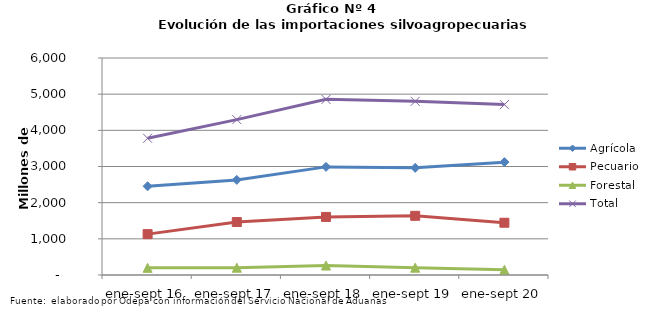
| Category | Agrícola | Pecuario | Forestal | Total |
|---|---|---|---|---|
| ene-sept 16 | 2452386 | 1129978 | 198194 | 3780558 |
| ene-sept 17 | 2629926 | 1464531 | 201873 | 4296330 |
| ene-sept 18 | 2989288 | 1605343 | 262118 | 4856749 |
| ene-sept 19 | 2962612 | 1636729 | 202106 | 4801447 |
| ene-sept 20 | 3120323 | 1445001 | 146442 | 4711766 |